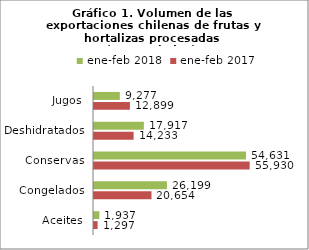
| Category | ene-feb 2017 | ene-feb 2018 |
|---|---|---|
| Aceites | 1296687.04 | 1937445.577 |
| Congelados | 20654359.54 | 26199356.5 |
| Conservas | 55930497.438 | 54631082.302 |
| Deshidratados | 14232907.06 | 17916679.68 |
| Jugos | 12899193.39 | 9277463.33 |